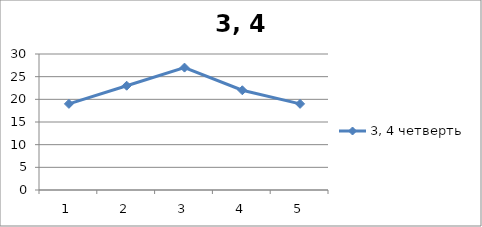
| Category | 3, 4 четверть |
|---|---|
| 0 | 19 |
| 1 | 23 |
| 2 | 27 |
| 3 | 22 |
| 4 | 19 |